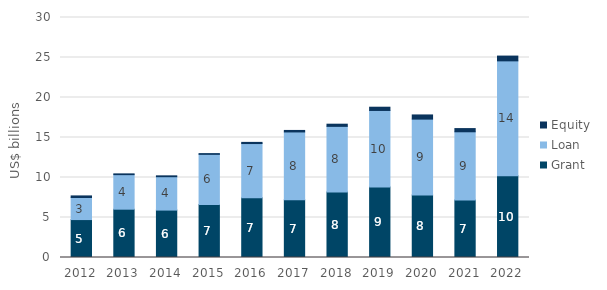
| Category | Grant | Loan | Equity |
|---|---|---|---|
| 2012.0 | 4.741 | 2.756 | 0.202 |
| 2013.0 | 6.04 | 4.317 | 0.098 |
| 2014.0 | 5.926 | 4.172 | 0.109 |
| 2015.0 | 6.623 | 6.271 | 0.091 |
| 2016.0 | 7.481 | 6.763 | 0.145 |
| 2017.0 | 7.223 | 8.471 | 0.188 |
| 2018.0 | 8.192 | 8.2 | 0.271 |
| 2019.0 | 8.801 | 9.578 | 0.407 |
| 2020.0 | 7.825 | 9.472 | 0.524 |
| 2021.0 | 7.176 | 8.538 | 0.4 |
| 2022.0 | 10.229 | 14.352 | 0.598 |